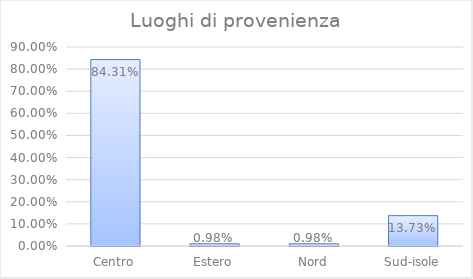
| Category | Series 0 |
|---|---|
| Centro | 0.843 |
| Estero | 0.01 |
| Nord | 0.01 |
| Sud-isole | 0.137 |